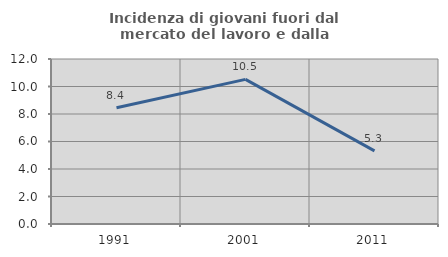
| Category | Incidenza di giovani fuori dal mercato del lavoro e dalla formazione  |
|---|---|
| 1991.0 | 8.449 |
| 2001.0 | 10.518 |
| 2011.0 | 5.319 |